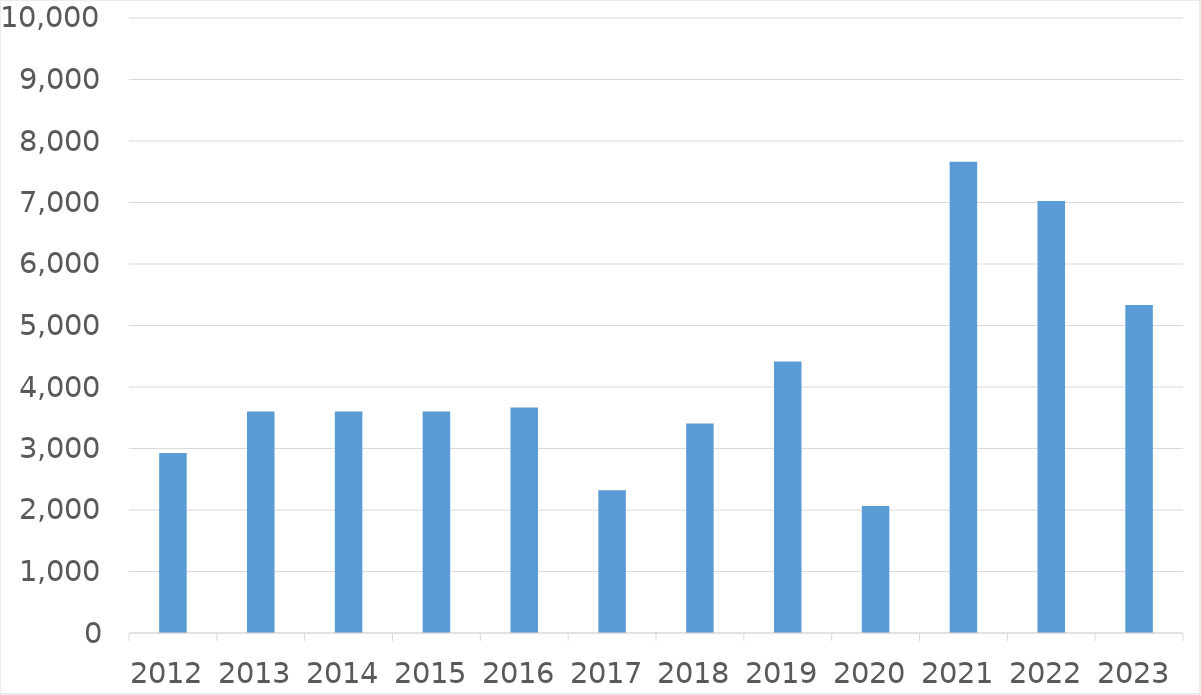
| Category | Series 0 |
|---|---|
| 2012 | 2925 |
| 2013 | 3600 |
| 2014 | 3600 |
| 2015 | 3600 |
| 2016 | 3666 |
| 2017 | 2320 |
| 2018 | 3406 |
| 2019 | 4413 |
| 2020 | 2065 |
| 2021 | 7664 |
| 2022 | 7023 |
| 2023 | 5333 |